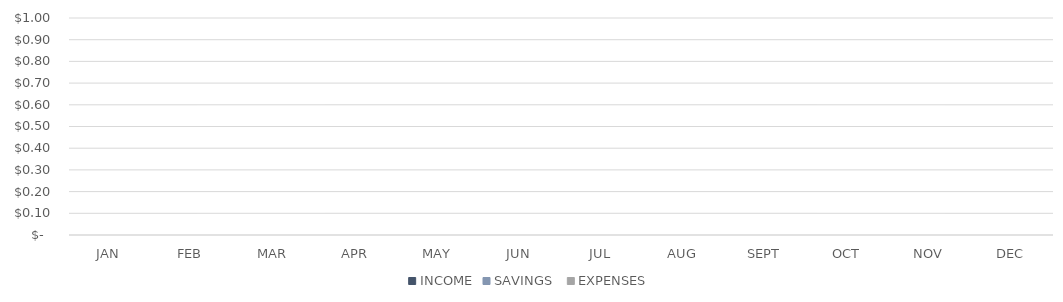
| Category | INCOME | SAVINGS  | EXPENSES |
|---|---|---|---|
| JAN | 0 | 0 | 0 |
| FEB | 0 | 0 | 0 |
| MAR | 0 | 0 | 0 |
| APR | 0 | 0 | 0 |
| MAY | 0 | 0 | 0 |
| JUN | 0 | 0 | 0 |
| JUL | 0 | 0 | 0 |
| AUG | 0 | 0 | 0 |
| SEPT | 0 | 0 | 0 |
| OCT | 0 | 0 | 0 |
| NOV | 0 | 0 | 0 |
| DEC | 0 | 0 | 0 |